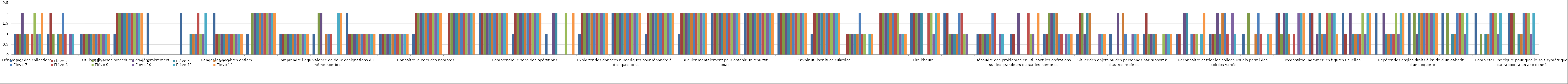
| Category | Elève 1 | Elève 2 | Elève 3 | Elève 4  | Elève 5 | Elève 6 | Elève 7 | Elève 8 | Elève 9 | Elève 10 | Elève 11 | Elève 12 |
|---|---|---|---|---|---|---|---|---|---|---|---|---|
| Dénombrer des collections  | 1 | 1 | 1 | 2 | 1 | 1 | 0 | 1 | 2 | 1 | 1 | 2 |
| Constituer des collections | 1 | 2 | 1 | 0 | 1 | 1 | 2 | 1 | 0 | 1 | 1 | 0 |
| Comparer des collections | 1 | 1 | 1 | 1 | 1 | 1 | 1 | 1 | 1 | 1 | 1 | 1 |
| Utiliser diverses procédures de dénombrement  | 1 | 2 | 2 | 2 | 2 | 2 | 2 | 2 | 2 | 2 | 2 | 2 |
| Repérer un rang ou une position dans une file ou sur une piste | 2 | 0 | 0 | 0 | 0 | 0 | 0 | 0 | 0 | 0 | 0 | 0 |
| Comparer des nombres entiers | 2 | 0 | 0 | 0 | 1 | 1 | 1 | 2 | 1 | 1 | 2 | 0 |
| Ranger les nombres entiers | 2 | 1 | 1 | 1 | 1 | 1 | 1 | 1 | 1 | 1 | 1 | 1 |
| Encadrer des nombres entiers | 1 | 0 | 2 | 2 | 2 | 2 | 2 | 2 | 2 | 2 | 2 | 2 |
| Connaître et/ou utiliser les symboles =, <, > | 1 | 1 | 1 | 1 | 1 | 1 | 1 | 1 | 1 | 1 | 1 | 1 |
| Comprendre l’équivalence de deux désignations du même nombre | 1 | 0 | 2 | 2 | 0 | 1 | 1 | 1 | 0 | 0 | 2 | 2 |
| Utiliser diverses représentations des nombres | 2 | 1 | 1 | 1 | 1 | 1 | 1 | 1 | 1 | 1 | 1 | 1 |
| Connaître la valeur des chiffres dans l’écriture d’un nombre | 1 | 1 | 1 | 1 | 1 | 1 | 1 | 1 | 1 | 1 | 1 | 1 |
| Connaître le nom des nombres | 1 | 2 | 2 | 2 | 2 | 2 | 2 | 2 | 2 | 2 | 2 | 2 |
| Connaître la comptine numérique | 0 | 2 | 2 | 2 | 2 | 2 | 2 | 2 | 2 | 2 | 2 | 2 |
| Réitérer une suite de 1 en 1, de 10 en 10, de 100 en 100 | 2 | 2 | 2 | 2 | 2 | 2 | 2 | 2 | 2 | 2 | 2 | 2 |
| Comprendre le sens des opérations  | 1 | 2 | 2 | 2 | 2 | 2 | 2 | 2 | 2 | 2 | 2 | 2 |
| Utiliser l’écriture mathématique pour résoudre des problèmes | 1 | 0 | 0 | 2 | 2 | 0 | 0 | 0 | 2 | 0 | 0 | 2 |
| Comprendre le sens des symboles +, -, x  | 1 | 2 | 2 | 2 | 2 | 2 | 2 | 2 | 2 | 2 | 2 | 2 |
| Exploiter des données numériques pour répondre à des questions | 2 | 2 | 2 | 2 | 2 | 2 | 2 | 2 | 2 | 2 | 2 | 2 |
| Lire et interpréter un tableau ou un graphique | 1 | 2 | 2 | 2 | 2 | 2 | 2 | 2 | 2 | 2 | 2 | 2 |
| Elaborer ou choisir des stratégies de calcul à l’oral et à l’écrit | 1 | 2 | 2 | 2 | 2 | 2 | 2 | 2 | 2 | 2 | 2 | 2 |
| Calculer mentalement pour obtenir un résultat exact | 2 | 2 | 2 | 2 | 2 | 2 | 2 | 2 | 2 | 2 | 2 | 2 |
| Calculer en utilisant des écritures additives, soustractives, multiplicatives | 2 | 2 | 2 | 2 | 2 | 2 | 2 | 2 | 2 | 2 | 2 | 2 |
| Maitriser la technique opératoire de l’addition, de la soustraction et de la multiplication | 2 | 2 | 2 | 2 | 2 | 2 | 2 | 2 | 2 | 2 | 2 | 2 |
| Savoir utiliser la calculatrice | 1 | 2 | 2 | 2 | 2 | 2 | 2 | 2 | 2 | 2 | 2 | 2 |
| Comparer des longueurs avec un instrument adapté | 0 | 1 | 1 | 1 | 1 | 1 | 2 | 1 | 1 | 0 | 1 | 1 |
| Exprimer une mesure en cm et mm  | 0 | 2 | 2 | 2 | 2 | 2 | 2 | 2 | 2 | 1 | 1 | 1 |
| Lire l’heure  | 2 | 2 | 2 | 2 | 2 | 0 | 0 | 2 | 2 | 1 | 2 | 2 |
| Estimer les ordres de grandeurs de quelques longueurs, masses et contenances | 2 | 2 | 1 | 1 | 1 | 1 | 2 | 2 | 1 | 1 | 0 | 0 |
| Utiliser le lexique spécifique à ces grandeurs | 1 | 1 | 1 | 1 | 1 | 1 | 2 | 2 | 0 | 1 | 1 | 0 |
| Résoudre des problèmes en utilisant les opérations sur les grandeurs ou sur les nombres | 1 | 1 | 0 | 2 | 0 | 0 | 0 | 2 | 1 | 1 | 0 | 2 |
| Se repérer dans son environnement proche | 1 | 1 | 2 | 2 | 2 | 2 | 1 | 1 | 0 | 1 | 1 | 1 |
| Situer des objets ou des personnes les uns par rapport aux autres | 1 | 2 | 2 | 1 | 2 | 2 | 0 | 0 | 0 | 1 | 1 | 1 |
| Situer des objets ou des personnes par rapport à d’autres repères | 1 | 0 | 0 | 2 | 0 | 2 | 1 | 0 | 0 | 1 | 1 | 1 |
| S’orienter et se déplacer en utilisant des repères | 1 | 2 | 1 | 1 | 1 | 1 | 0 | 0 | 1 | 1 | 1 | 1 |
| Code er décode pour prévoir, représenter et réaliser des déplacements  | 1 | 1 | 0 | 2 | 2 | 0 | 1 | 1 | 1 | 0 | 1 | 2 |
| Reconnaitre et trier les solides usuels parmi des solides variés | 1 | 1 | 1 | 2 | 1 | 2 | 2 | 1 | 0 | 2 | 1 | 0 |
| Reproduire des figures sur papier quadrillé | 1 | 0 | 2 | 0 | 0 | 1 | 2 | 1 | 0 | 0 | 1 | 1 |
| Utiliser la règle, le compas comme instruments de tracé | 2 | 2 | 1 | 2 | 2 | 1 | 0 | 1 | 0 | 2 | 2 | 2 |
| Reconnaitre, nommer les figures usuelles | 2 | 2 | 0 | 1 | 2 | 1 | 1 | 2 | 2 | 2 | 2 | 1 |
| Construire un cercle connaissant son centre et un point, ou son centre et son rayon | 2 | 1 | 0 | 2 | 1 | 1 | 1 | 1 | 2 | 1 | 2 | 2 |
| Utiliser la règle pour repérer et produire des alignements | 2 | 0 | 0 | 2 | 1 | 1 | 1 | 1 | 2 | 1 | 2 | 2 |
| Repérer des angles droits à l’aide d’un gabarit, d’une équerre | 2 | 0 | 2 | 1 | 2 | 2 | 2 | 2 | 2 | 2 | 2 | 2 |
| Reporter une longueur sur une droite déjà tracée | 2 | 0 | 2 | 0 | 1 | 1 | 2 | 2 | 2 | 1 | 2 | 0 |
| Reconnaitre si une figure présente un axe de symétrie | 2 | 0 | 1 | 0 | 1 | 1 | 2 | 2 | 2 | 1 | 2 | 0 |
| Compléter une figure pour qu’elle soit symétrique par rapport à un axe donné | 2 | 2 | 2 | 0 | 1 | 1 | 2 | 2 | 2 | 1 | 2 | 0 |